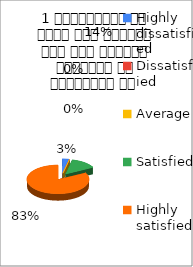
| Category | 1 व्याख्यान से रूचि में वृद्धि हुई एवं शिक्षण जानकारी से परिपूर्ण था  |
|---|---|
| Highly dissatisfied | 1 |
| Dissatisfied | 0 |
| Average | 0 |
| Satisfied | 4 |
| Highly satisfied | 24 |